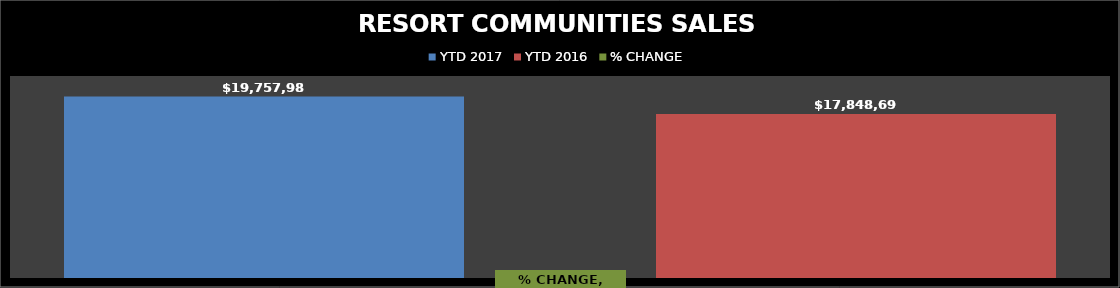
| Category | YTD 2017 | YTD 2016 |
|---|---|---|
| RESORT COMMUNITIES SALES TAX - 2017 | 19757983.12 | 17848696.65 |